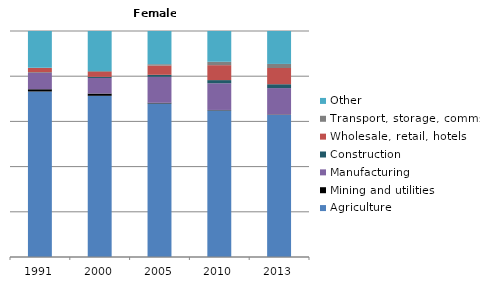
| Category | Agriculture | Mining and utilities | Manufacturing | Construction | Wholesale, retail, hotels | Transport, storage, comms | Other |
|---|---|---|---|---|---|---|---|
| 1991.0 | 73.3 | 1 | 7.3 | 0.2 | 1.9 | 0.1 | 16.3 |
| 2000.0 | 71.4 | 1 | 6.9 | 0.5 | 2.2 | 0.4 | 17.7 |
| 2005.0 | 68 | 0.3 | 11.5 | 0.9 | 4.1 | 0.6 | 14.7 |
| 2010.0 | 64.8 | 0.2 | 11.8 | 1.4 | 6.6 | 1.5 | 13.6 |
| 2013.0 | 63 | 0.2 | 11.7 | 1.7 | 7.2 | 1.8 | 14.6 |